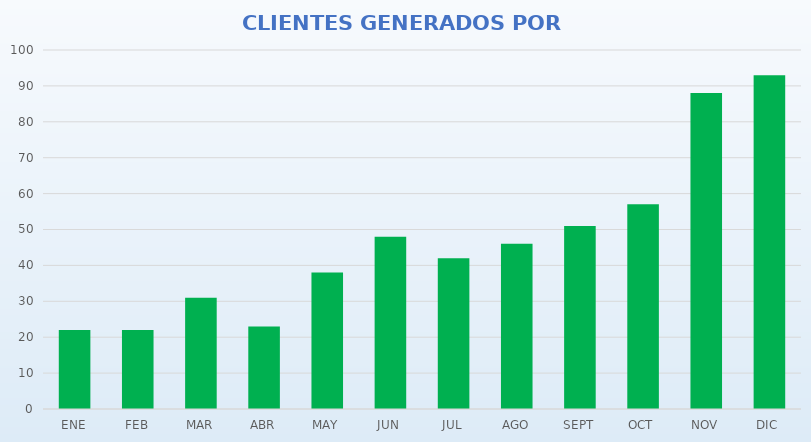
| Category | GRAN TOTAL |
|---|---|
| ENE | 22 |
| FEB | 22 |
| MAR | 31 |
| ABR | 23 |
| MAY | 38 |
| JUN | 48 |
| JUL | 42 |
| AGO | 46 |
| SEPT | 51 |
| OCT | 57 |
| NOV | 88 |
| DIC | 93 |